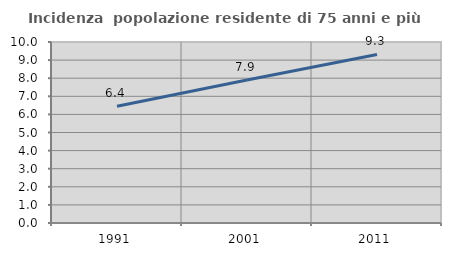
| Category | Incidenza  popolazione residente di 75 anni e più |
|---|---|
| 1991.0 | 6.449 |
| 2001.0 | 7.897 |
| 2011.0 | 9.315 |